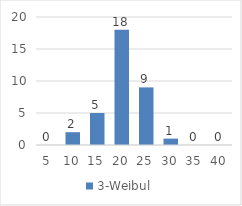
| Category | 3-Weibul |
|---|---|
| 5.0 | 0 |
| 10.0 | 2 |
| 15.0 | 5 |
| 20.0 | 18 |
| 25.0 | 9 |
| 30.0 | 1 |
| 35.0 | 0 |
| 40.0 | 0 |